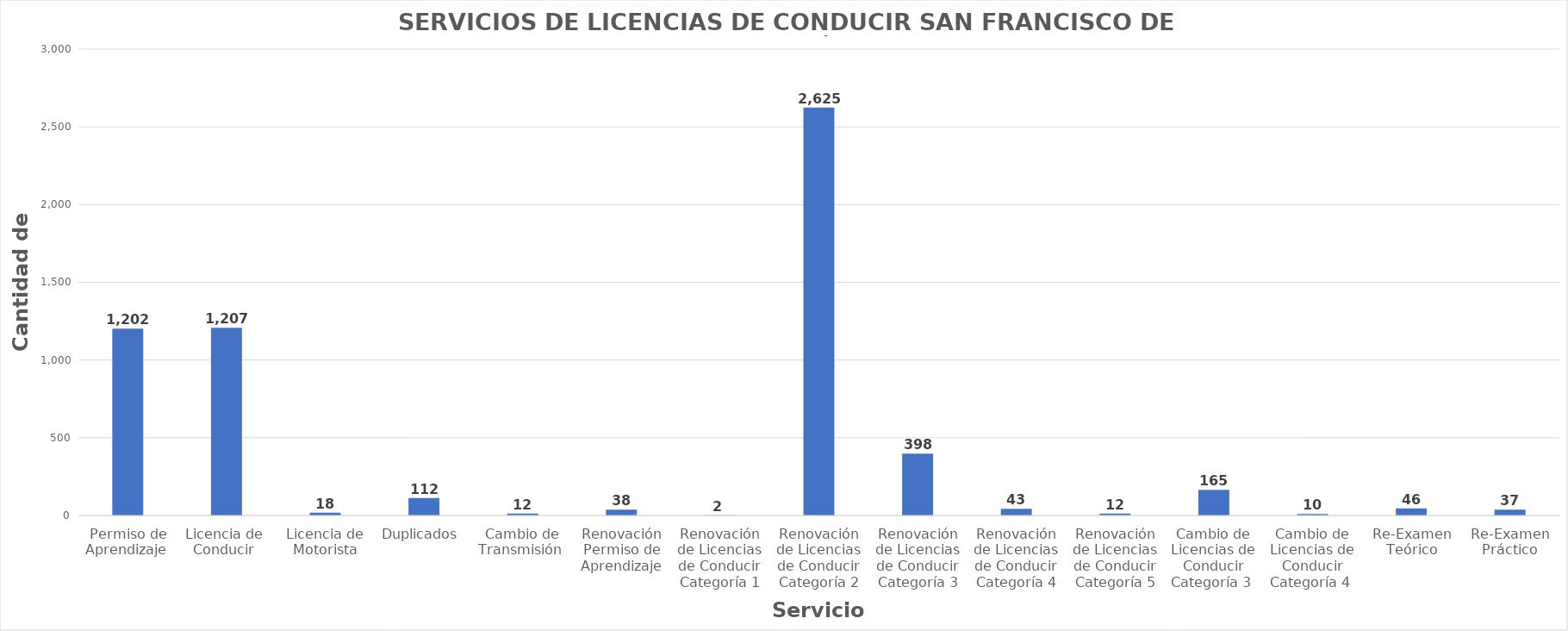
| Category | Series 0 |
|---|---|
| Permiso de Aprendizaje  | 1202 |
| Licencia de  Conducir  | 1207 |
| Licencia de Motorista | 18 |
| Duplicados  | 112 |
| Cambio de Transmisión  | 12 |
| Renovación Permiso de Aprendizaje | 38 |
| Renovación de Licencias de Conducir Categoría 1 | 2 |
| Renovación de Licencias de Conducir Categoría 2 | 2625 |
| Renovación de Licencias de Conducir Categoría 3 | 398 |
| Renovación de Licencias de Conducir Categoría 4 | 43 |
| Renovación de Licencias de Conducir Categoría 5 | 12 |
| Cambio de Licencias de Conducir Categoría 3  | 165 |
| Cambio de Licencias de Conducir Categoría 4  | 10 |
| Re-Examen Teórico | 46 |
| Re-Examen Práctico | 37 |